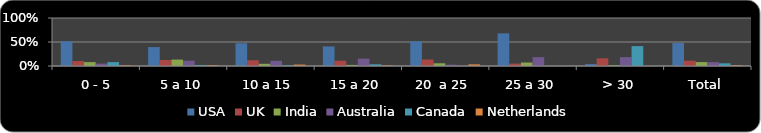
| Category |  USA  |  UK  |  India  |  Australia  |  Canada  |  Netherlands  |
|---|---|---|---|---|---|---|
|  0 - 5 | 0.516 | 0.104 | 0.081 | 0.05 | 0.081 | 0.015 |
| 5 a 10 | 0.394 | 0.125 | 0.134 | 0.111 | 0.022 | 0.019 |
| 10 a 15 | 0.474 | 0.12 | 0.046 | 0.108 | 0.013 | 0.03 |
| 15 a 20 | 0.407 | 0.11 | 0.023 | 0.153 | 0.036 | 0.013 |
| 20  a 25 | 0.516 | 0.135 | 0.057 | 0.027 | 0 | 0.035 |
| 25 a 30 | 0.68 | 0.05 | 0.072 | 0.183 | 0 | 0 |
| > 30 | 0.04 | 0.159 | 0.018 | 0.184 | 0.414 | 0 |
| Total | 0.478 | 0.11 | 0.081 | 0.08 | 0.056 | 0.018 |